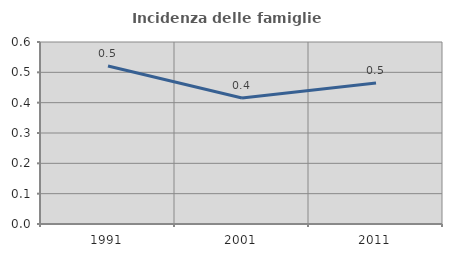
| Category | Incidenza delle famiglie numerose |
|---|---|
| 1991.0 | 0.521 |
| 2001.0 | 0.415 |
| 2011.0 | 0.465 |